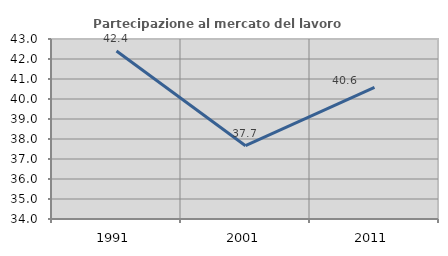
| Category | Partecipazione al mercato del lavoro  femminile |
|---|---|
| 1991.0 | 42.397 |
| 2001.0 | 37.665 |
| 2011.0 | 40.58 |